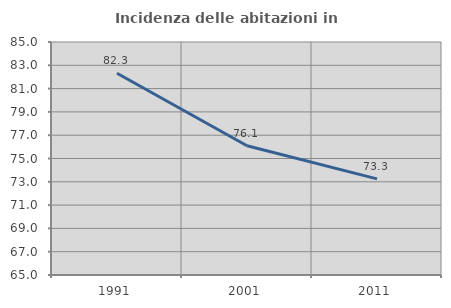
| Category | Incidenza delle abitazioni in proprietà  |
|---|---|
| 1991.0 | 82.314 |
| 2001.0 | 76.093 |
| 2011.0 | 73.253 |